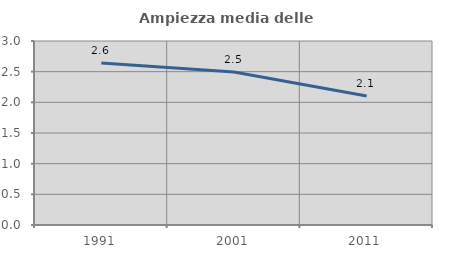
| Category | Ampiezza media delle famiglie |
|---|---|
| 1991.0 | 2.643 |
| 2001.0 | 2.494 |
| 2011.0 | 2.104 |